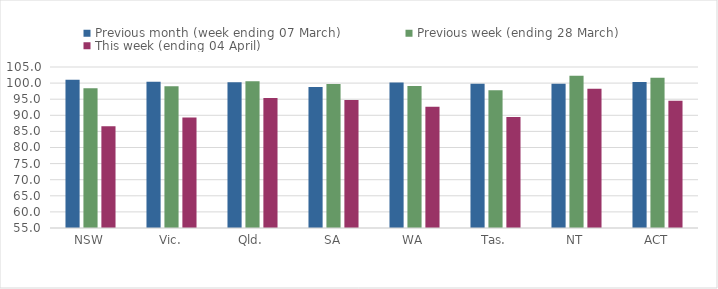
| Category | Previous month (week ending 07 March) | Previous week (ending 28 March) | This week (ending 04 April) |
|---|---|---|---|
| NSW | 101.02 | 98.396 | 86.623 |
| Vic. | 100.416 | 99.036 | 89.348 |
| Qld. | 100.296 | 100.57 | 95.398 |
| SA | 98.808 | 99.724 | 94.759 |
| WA | 100.196 | 99.102 | 92.681 |
| Tas. | 99.819 | 97.771 | 89.476 |
| NT | 99.769 | 102.308 | 98.246 |
| ACT | 100.37 | 101.64 | 94.516 |